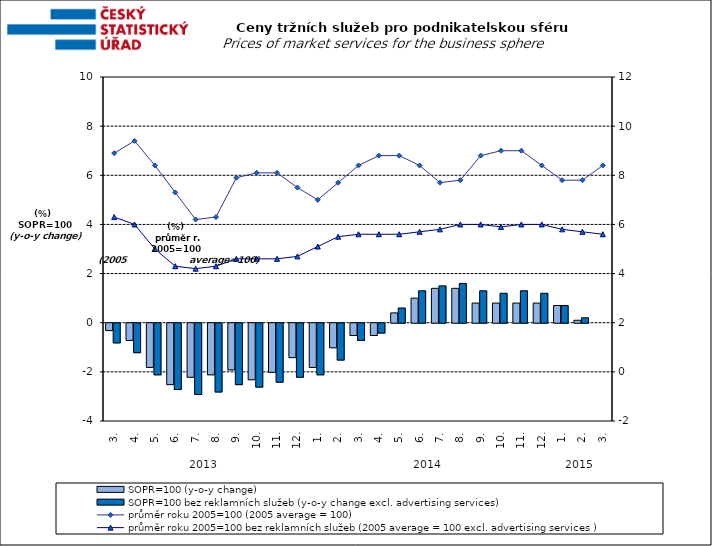
| Category | SOPR=100 (y-o-y change)   | SOPR=100 bez reklamních služeb (y-o-y change excl. advertising services)   |
|---|---|---|
| 0 | -0.3 | -0.8 |
| 1 | -0.7 | -1.2 |
| 2 | -1.8 | -2.1 |
| 3 | -2.5 | -2.7 |
| 4 | -2.2 | -2.9 |
| 5 | -2.1 | -2.8 |
| 6 | -1.9 | -2.5 |
| 7 | -2.3 | -2.6 |
| 8 | -2 | -2.4 |
| 9 | -1.4 | -2.2 |
| 10 | -1.8 | -2.1 |
| 11 | -1 | -1.5 |
| 12 | -0.5 | -0.7 |
| 13 | -0.5 | -0.4 |
| 14 | 0.4 | 0.6 |
| 15 | 1 | 1.3 |
| 16 | 1.4 | 1.5 |
| 17 | 1.4 | 1.6 |
| 18 | 0.8 | 1.3 |
| 19 | 0.8 | 1.2 |
| 20 | 0.8 | 1.3 |
| 21 | 0.8 | 1.2 |
| 22 | 0.7 | 0.7 |
| 23 | 0.1 | 0.2 |
| 24 | 0 | 0 |